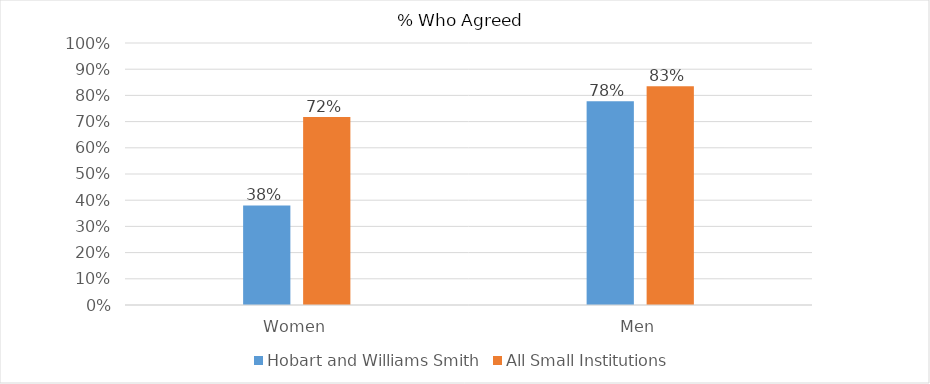
| Category | Hobart and Williams Smith | All Small Institutions |
|---|---|---|
| Women | 0.38 | 0.718 |
| Men | 0.778 | 0.835 |